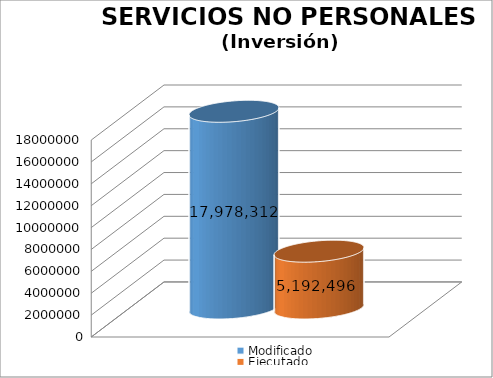
| Category | Modificado | Ejecutado |
|---|---|---|
| 0 | 17978312 | 5192495.51 |